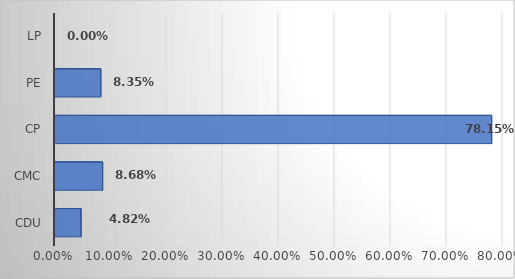
| Category | Series 0 |
|---|---|
| CDU | 0.048 |
| CMC | 0.087 |
| CP | 0.782 |
| PE | 0.083 |
| LP | 0 |